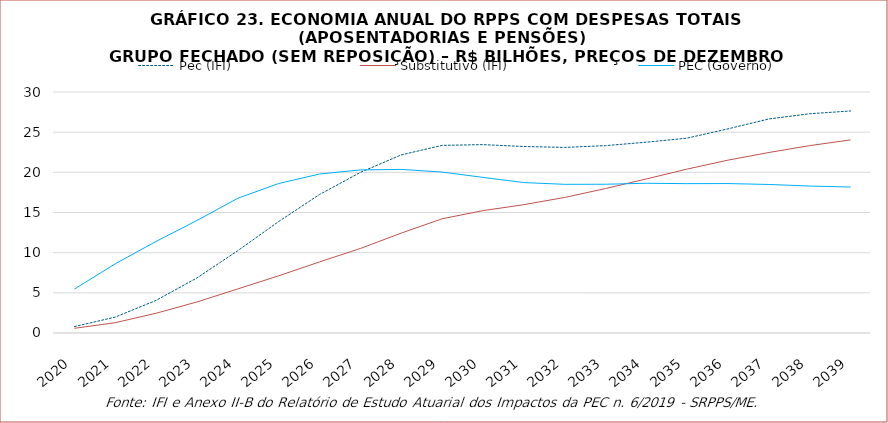
| Category | Pec (IFI) | Substitutivo (IFI) | PEC (Governo) |
|---|---|---|---|
| 2020.0 | 793722235.262 | 583857905.115 | 5473057161 |
| 2021.0 | 1983268420.291 | 1284995379.364 | 8613497175 |
| 2022.0 | 4060259857.821 | 2460056261.413 | 11404437554 |
| 2023.0 | 6856910240.328 | 3863162811.021 | 14008581642 |
| 2024.0 | 10248418981.637 | 5487007412.953 | 16772753894 |
| 2025.0 | 13878480503.928 | 7120309970.461 | 18611294629 |
| 2026.0 | 17238983863.181 | 8847317209.265 | 19789771470 |
| 2027.0 | 19992783446.597 | 10521953170.106 | 20299366620 |
| 2028.0 | 22168723351.461 | 12434019287.591 | 20364943918 |
| 2029.0 | 23355550930.576 | 14216743553.369 | 20035184003 |
| 2030.0 | 23450124819.241 | 15230551224.165 | 19371591556 |
| 2031.0 | 23216154572.534 | 15973569254.501 | 18725476629 |
| 2032.0 | 23102039471.865 | 16872740832.66 | 18507746518 |
| 2033.0 | 23323696572.193 | 17978943913.888 | 18517326952 |
| 2034.0 | 23750235718.959 | 19176789425.712 | 18639289343 |
| 2035.0 | 24257293300.169 | 20404687542.244 | 18591777415 |
| 2036.0 | 25415438560.741 | 21519464646.823 | 18602782357 |
| 2037.0 | 26641758909.339 | 22467382472.037 | 18488937219 |
| 2038.0 | 27293379537.056 | 23325757266.1 | 18293879280 |
| 2039.0 | 27638140452.113 | 24034713011.799 | 18171183656 |